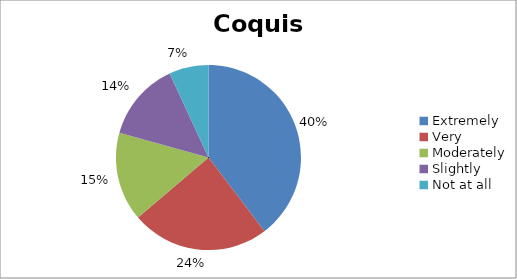
| Category | Coquis |
|---|---|
| Extremely | 23 |
| Very | 14 |
| Moderately | 9 |
| Slightly | 8 |
| Not at all | 4 |